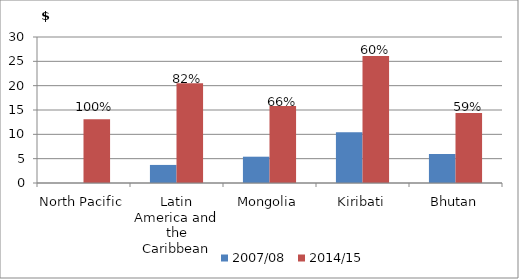
| Category | 2007/08 | 2014/15 |
|---|---|---|
| North Pacific | 0 | 13.105 |
| Latin America and the Caribbean | 3.713 | 20.482 |
| Mongolia | 5.405 | 15.823 |
| Kiribati | 10.45 | 26.113 |
| Bhutan | 5.953 | 14.367 |